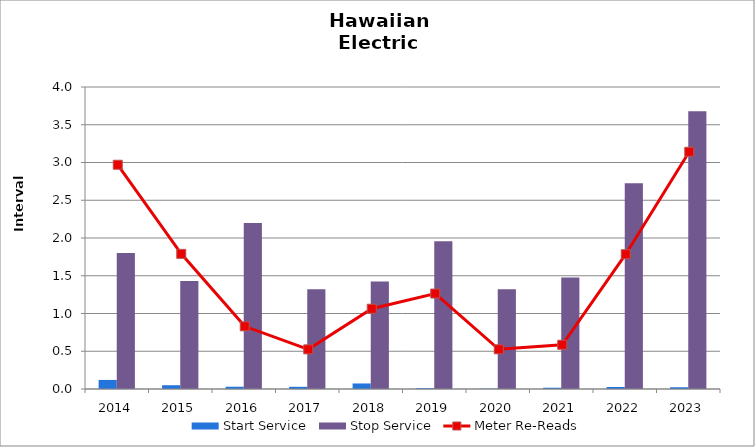
| Category | Start Service | Stop Service |
|---|---|---|
| 2014.0 | 0.12 | 1.8 |
| 2015.0 | 0.05 | 1.43 |
| 2016.0 | 0.03 | 2.2 |
| 2017.0 | 0.029 | 1.32 |
| 2018.0 | 0.073 | 1.425 |
| 2019.0 | 0.011 | 1.956 |
| 2020.0 | 0.005 | 1.321 |
| 2021.0 | 0.017 | 1.477 |
| 2022.0 | 0.027 | 2.726 |
| 2023.0 | 0.023 | 3.677 |